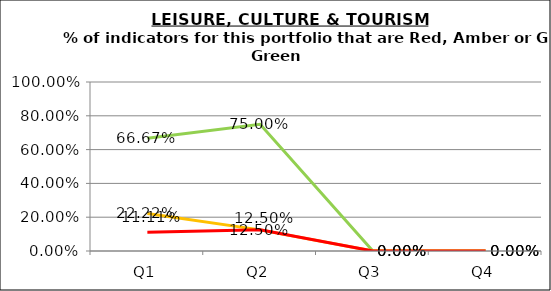
| Category | Green | Amber | Red |
|---|---|---|---|
| Q1 | 0.667 | 0.222 | 0.111 |
| Q2 | 0.75 | 0.125 | 0.125 |
| Q3 | 0 | 0 | 0 |
| Q4 | 0 | 0 | 0 |